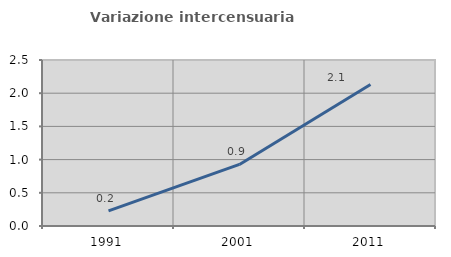
| Category | Variazione intercensuaria annua |
|---|---|
| 1991.0 | 0.228 |
| 2001.0 | 0.928 |
| 2011.0 | 2.132 |